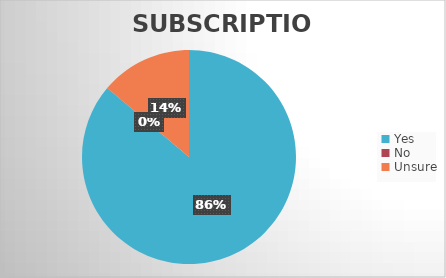
| Category | Series 0 |
|---|---|
| Yes | 56 |
| No | 0 |
| Unsure | 9 |